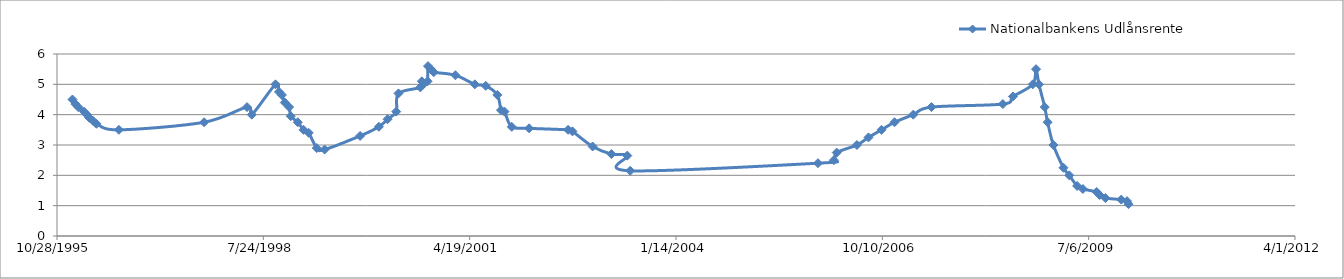
| Category | Nationalbankens Udlånsrente |
|---|---|
| 40193.0 | 1.05 |
| 40186.0 | 1.15 |
| 40158.0 | 1.2 |
| 40081.0 | 1.25 |
| 40053.0 | 1.35 |
| 40039.0 | 1.45 |
| 39972.0 | 1.55 |
| 39944.0 | 1.65 |
| 39906.0 | 2 |
| 39878.0 | 2.25 |
| 39829.0 | 3 |
| 39801.0 | 3.75 |
| 39787.0 | 4.25 |
| 39759.0 | 5 |
| 39745.0 | 5.5 |
| 39729.0 | 5 |
| 39633.0 | 4.6 |
| 39584.0 | 4.35 |
| 39238.0 | 4.25 |
| 39150.0 | 4 |
| 39059.0 | 3.75 |
| 38996.0 | 3.5 |
| 38933.0 | 3.25 |
| 38877.0 | 3 |
| 38779.0 | 2.75 |
| 38765.0 | 2.5 |
| 38688.0 | 2.4 |
| 37778.0 | 2.15 |
| 37764.0 | 2.65 |
| 37687.0 | 2.7 |
| 37596.0 | 2.95 |
| 37498.0 | 3.45 |
| 37477.0 | 3.5 |
| 37288.0 | 3.55 |
| 37204.0 | 3.6 |
| 37169.0 | 4.1 |
| 37152.0 | 4.15 |
| 37134.0 | 4.65 |
| 37078.0 | 4.95 |
| 37025.0 | 5 |
| 36931.0 | 5.3 |
| 36826.0 | 5.4 |
| 36812.0 | 5.5 |
| 36798.0 | 5.6 |
| 36796.0 | 5.1 |
| 36775.0 | 5 |
| 36768.0 | 5.1 |
| 36761.0 | 4.9 |
| 36655.0 | 4.7 |
| 36644.0 | 4.1 |
| 36602.0 | 3.85 |
| 36560.0 | 3.6 |
| 36469.0 | 3.3 |
| 36297.0 | 2.85 |
| 36259.0 | 2.9 |
| 36220.0 | 3.4 |
| 36195.0 | 3.5 |
| 36167.0 | 3.75 |
| 36133.0 | 3.95 |
| 36125.0 | 4.25 |
| 36104.0 | 4.4 |
| 36090.0 | 4.65 |
| 36076.0 | 4.75 |
| 36059.0 | 5 |
| 35944.0 | 4 |
| 35921.0 | 4.25 |
| 35713.0 | 3.75 |
| 35300.0 | 3.5 |
| 35191.0 | 3.7 |
| 35174.0 | 3.8 |
| 35156.0 | 3.9 |
| 35145.0 | 4 |
| 35131.0 | 4.1 |
| 35103.0 | 4.25 |
| 35089.0 | 4.35 |
| 35075.0 | 4.5 |